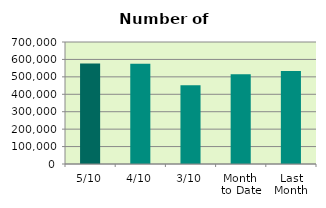
| Category | Series 0 |
|---|---|
| 5/10 | 577228 |
| 4/10 | 574792 |
| 3/10 | 451776 |
| Month 
to Date | 514767.6 |
| Last
Month | 533338.9 |